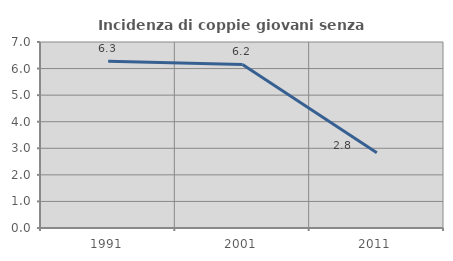
| Category | Incidenza di coppie giovani senza figli |
|---|---|
| 1991.0 | 6.273 |
| 2001.0 | 6.154 |
| 2011.0 | 2.834 |